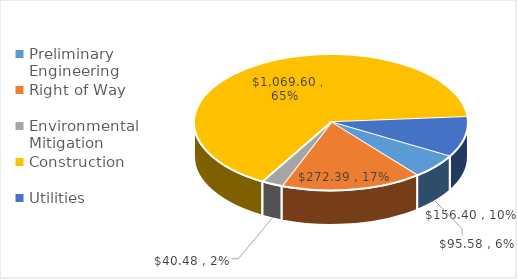
| Category | Series 0 |
|---|---|
| Preliminary Engineering | 95.58 |
| Right of Way | 272.39 |
| Environmental Mitigation | 40.48 |
| Construction | 1069.6 |
| Utilities | 156.4 |